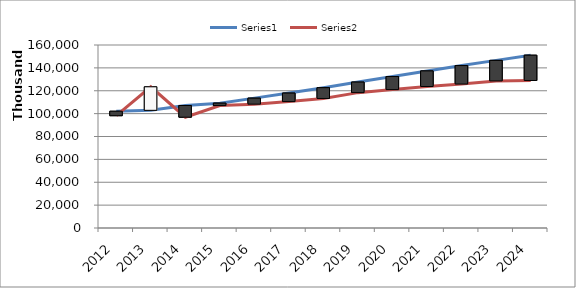
| Category | Series 0 | Series 1 |
|---|---|---|
| 2012.0 | 102101373.5 | 98182288.1 |
| 2013.0 | 102891930.3 | 123444031.94 |
| 2014.0 | 107100203.64 | 96876666.03 |
| 2015.0 | 109167730 | 107024624 |
| 2016.0 | 113538641 | 108281643 |
| 2017.0 | 117966648 | 110530972 |
| 2018.0 | 122685314 | 113264977 |
| 2019.0 | 127592727 | 118355238 |
| 2020.0 | 132441251 | 121006865 |
| 2021.0 | 137341577 | 123724608 |
| 2022.0 | 142011191 | 125855292 |
| 2023.0 | 146555549 | 128586817 |
| 2024.0 | 151098771 | 128983540 |